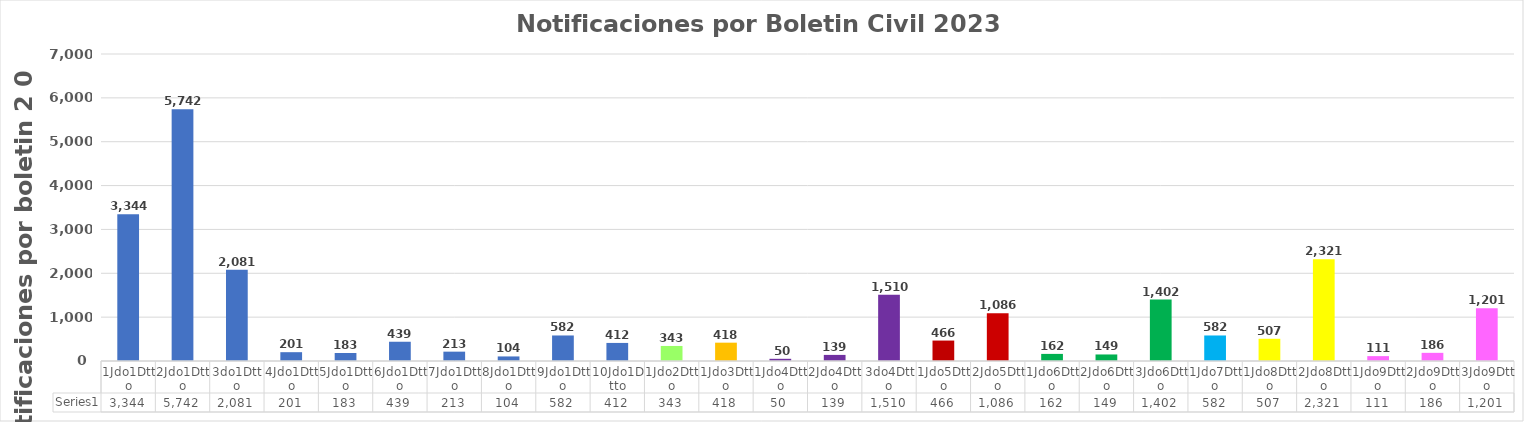
| Category | Series 0 |
|---|---|
| 1Jdo1Dtto | 3344 |
| 2Jdo1Dtto | 5742 |
| 3do1Dtto | 2081 |
| 4Jdo1Dtto | 201 |
| 5Jdo1Dtto | 183 |
| 6Jdo1Dtto | 439 |
| 7Jdo1Dtto | 213 |
| 8Jdo1Dtto | 104 |
| 9Jdo1Dtto | 582 |
| 10Jdo1Dtto | 412 |
| 1Jdo2Dtto | 343 |
| 1Jdo3Dtto | 418 |
| 1Jdo4Dtto | 50 |
| 2Jdo4Dtto | 139 |
| 3do4Dtto | 1510 |
| 1Jdo5Dtto | 466 |
| 2Jdo5Dtto | 1086 |
| 1Jdo6Dtto | 162 |
| 2Jdo6Dtto | 149 |
| 3Jdo6Dtto | 1402 |
| 1Jdo7Dtto | 582 |
| 1Jdo8Dtto | 507 |
| 2Jdo8Dtto | 2321 |
| 1Jdo9Dtto | 111 |
| 2Jdo9Dtto | 186 |
| 3Jdo9Dtto | 1201 |